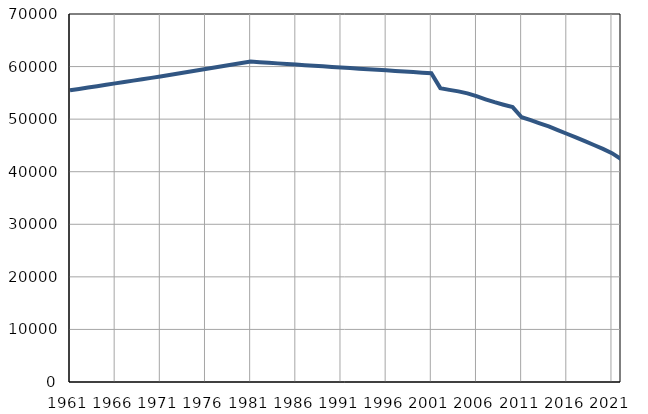
| Category | Population
size |
|---|---|
| 1961.0 | 55488 |
| 1962.0 | 55750 |
| 1963.0 | 56013 |
| 1964.0 | 56275 |
| 1965.0 | 56538 |
| 1966.0 | 56800 |
| 1967.0 | 57062 |
| 1968.0 | 57325 |
| 1969.0 | 57587 |
| 1970.0 | 57850 |
| 1971.0 | 58112 |
| 1972.0 | 58395 |
| 1973.0 | 58679 |
| 1974.0 | 58962 |
| 1975.0 | 59245 |
| 1976.0 | 59529 |
| 1977.0 | 59812 |
| 1978.0 | 60095 |
| 1979.0 | 60378 |
| 1980.0 | 60662 |
| 1981.0 | 60945 |
| 1982.0 | 60833 |
| 1983.0 | 60720 |
| 1984.0 | 60608 |
| 1985.0 | 60496 |
| 1986.0 | 60383 |
| 1987.0 | 60270 |
| 1988.0 | 60158 |
| 1989.0 | 60046 |
| 1990.0 | 59934 |
| 1991.0 | 59822 |
| 1992.0 | 59714 |
| 1993.0 | 59604 |
| 1994.0 | 59497 |
| 1995.0 | 59388 |
| 1996.0 | 59280 |
| 1997.0 | 59171 |
| 1998.0 | 59062 |
| 1999.0 | 58954 |
| 2000.0 | 58846 |
| 2001.0 | 58737 |
| 2002.0 | 55897 |
| 2003.0 | 55572 |
| 2004.0 | 55282 |
| 2005.0 | 54894 |
| 2006.0 | 54367 |
| 2007.0 | 53778 |
| 2008.0 | 53225 |
| 2009.0 | 52746 |
| 2010.0 | 52285 |
| 2011.0 | 50359 |
| 2012.0 | 49801 |
| 2013.0 | 49185 |
| 2014.0 | 48611 |
| 2015.0 | 47929 |
| 2016.0 | 47221 |
| 2017.0 | 46543 |
| 2018.0 | 45823 |
| 2019.0 | 45080 |
| 2020.0 | 44341 |
| 2021.0 | 43535 |
| 2022.0 | 42400 |